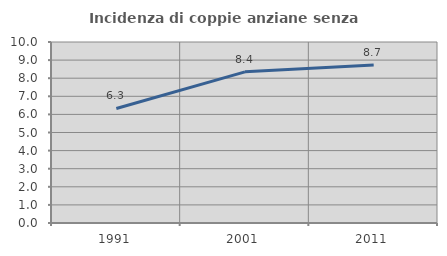
| Category | Incidenza di coppie anziane senza figli  |
|---|---|
| 1991.0 | 6.329 |
| 2001.0 | 8.35 |
| 2011.0 | 8.733 |